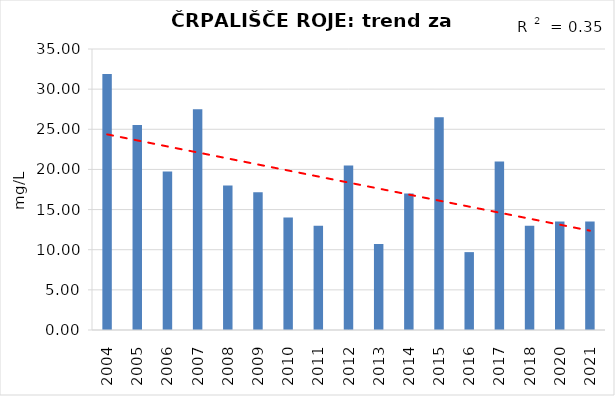
| Category | Vsota |
|---|---|
| 2004 | 31.9 |
| 2005 | 25.533 |
| 2006 | 19.75 |
| 2007 | 27.5 |
| 2008 | 18 |
| 2009 | 17.15 |
| 2010 | 14 |
| 2011 | 13 |
| 2012 | 20.5 |
| 2013 | 10.7 |
| 2014 | 17 |
| 2015 | 26.5 |
| 2016 | 9.7 |
| 2017 | 21 |
| 2018 | 13 |
| 2020 | 13.5 |
| 2021 | 13.5 |